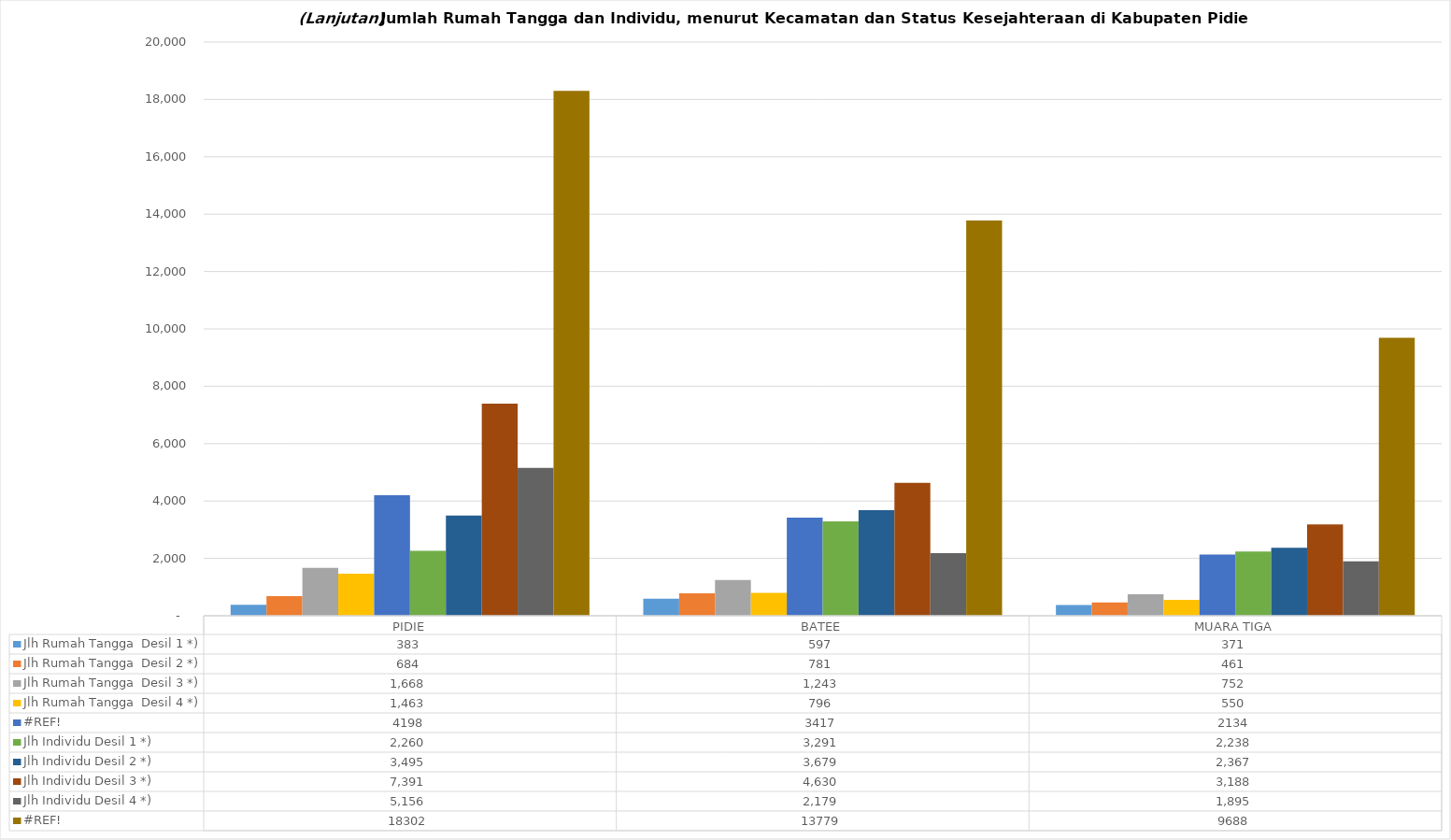
| Category | Jlh Rumah Tangga  Desil 1 *) | Jlh Rumah Tangga  Desil 2 *) | Jlh Rumah Tangga  Desil 3 *) | Jlh Rumah Tangga  Desil 4 *) | #REF! | Jlh Individu Desil 1 *) | Jlh Individu Desil 2 *) | Jlh Individu Desil 3 *) | Jlh Individu Desil 4 *) |
|---|---|---|---|---|---|---|---|---|---|
| PIDIE | 383 | 684 | 1668 | 1463 | 18302 | 2260 | 3495 | 7391 | 5156 |
| BATEE | 597 | 781 | 1243 | 796 | 13779 | 3291 | 3679 | 4630 | 2179 |
| MUARA TIGA | 371 | 461 | 752 | 550 | 9688 | 2238 | 2367 | 3188 | 1895 |